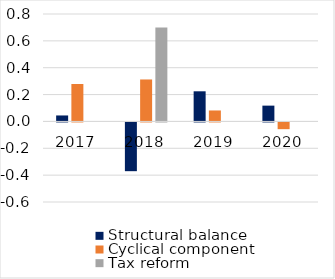
| Category | Structural balance | Cyclical component | Tax reform |
|---|---|---|---|
| 2017.0 | 0.044 | 0.279 | 0 |
| 2018.0 | -0.363 | 0.312 | 0.7 |
| 2019.0 | 0.224 | 0.082 | 0 |
| 2020.0 | 0.118 | -0.05 | 0 |